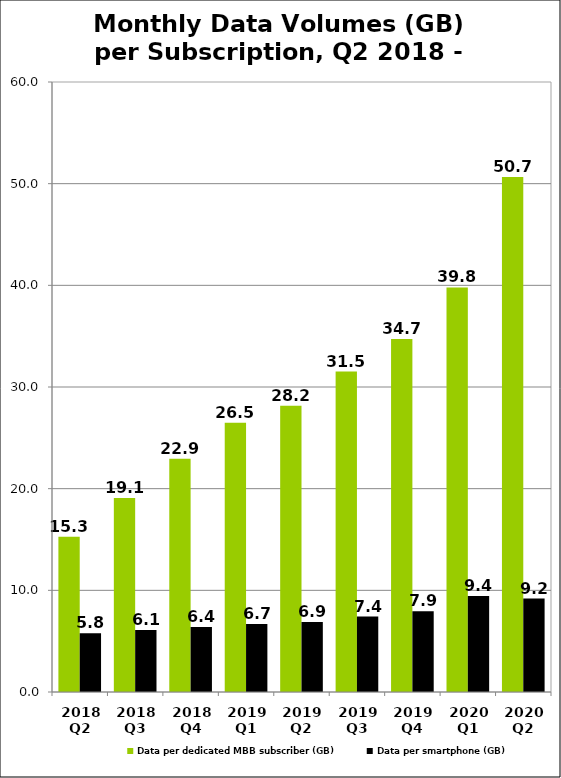
| Category | Data per dedicated MBB subscriber (GB) | Data per smartphone (GB) |
|---|---|---|
| 2018 Q2 | 15.277 | 5.782 |
| 2018 Q3 | 19.091 | 6.097 |
| 2018 Q4 | 22.941 | 6.397 |
| 2019 Q1 | 26.474 | 6.695 |
| 2019 Q2 | 28.158 | 6.875 |
| 2019 Q3 | 31.516 | 7.42 |
| 2019 Q4 | 34.728 | 7.943 |
| 2020 Q1 | 39.797 | 9.433 |
| 2020 Q2 | 50.654 | 9.193 |